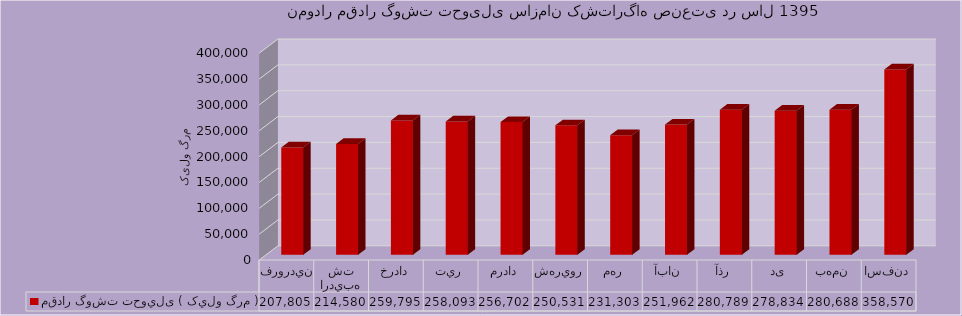
| Category | مقدار گوشت تحويلی ( کيلو گرم ) |
|---|---|
| فروردين | 207805 |
| ارديبهشت | 214580 |
| خرداد | 259795 |
| تير | 258093 |
| مرداد | 256702 |
| شهريور | 250531 |
| مهر | 231303 |
| آبان | 251962 |
| آذر | 280789 |
| دی | 278834 |
| بهمن | 280688 |
| اسفند | 358570 |